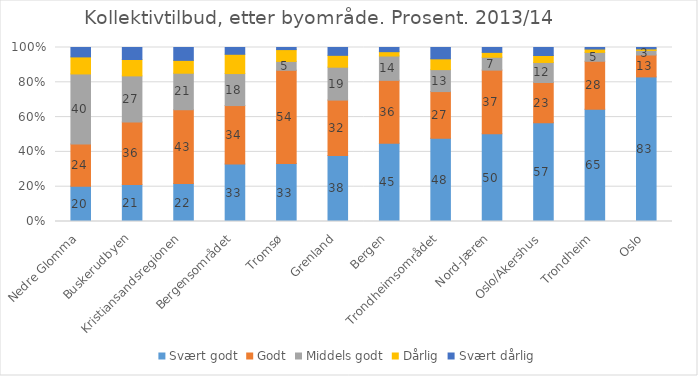
| Category | Svært godt | Godt | Middels godt | Dårlig | Svært dårlig |
|---|---|---|---|---|---|
| Nedre Glomma | 20.3 | 24.3 | 40.2 | 9.8 | 5.4 |
| Buskerudbyen | 21.2 | 35.9 | 26.5 | 9.4 | 6.9 |
| Kristiansandsregionen | 21.8 | 42.5 | 21 | 7.4 | 7.4 |
| Bergensområdet | 33.1 | 33.6 | 18.4 | 11.1 | 3.9 |
| Tromsø | 33.3 | 53.6 | 5.1 | 6.8 | 1.2 |
| Grenland | 37.9 | 31.8 | 18.9 | 6.8 | 4.5 |
| Bergen | 45 | 36.2 | 14 | 2.5 | 2.4 |
| Trondheimsområdet | 47.8 | 26.8 | 12.6 | 6.2 | 6.5 |
| Nord-Jæren | 50.4 | 36.6 | 7.4 | 2.8 | 2.8 |
| Oslo/Akershus | 56.8 | 23.1 | 11.5 | 4 | 4.6 |
| Trondheim | 64.5 | 27.5 | 5.1 | 1.9 | 0.9 |
| Oslo | 83.1 | 12.6 | 2.6 | 0.9 | 0.8 |